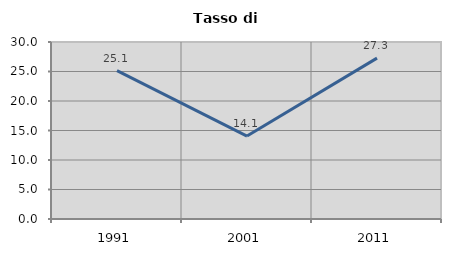
| Category | Tasso di disoccupazione   |
|---|---|
| 1991.0 | 25.134 |
| 2001.0 | 14.058 |
| 2011.0 | 27.273 |